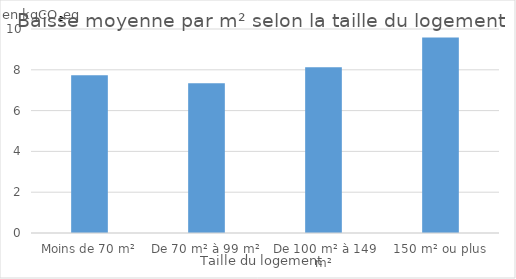
| Category | Baisse moyenne |
|---|---|
| Moins de 70 m² | 7.735 |
| De 70 m² à 99 m² | 7.34 |
| De 100 m² à 149 m² | 8.129 |
| 150 m² ou plus | 9.588 |